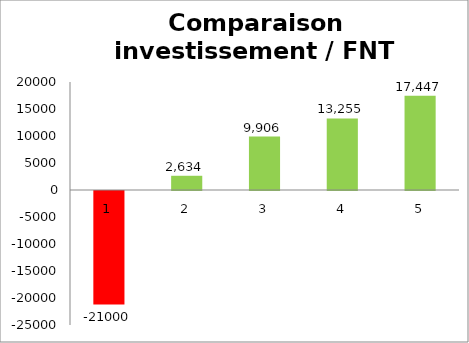
| Category | Series 0 |
|---|---|
| 0 | -21000 |
| 1 | 2634.01 |
| 2 | 9906.375 |
| 3 | 13255.186 |
| 4 | 17447.327 |